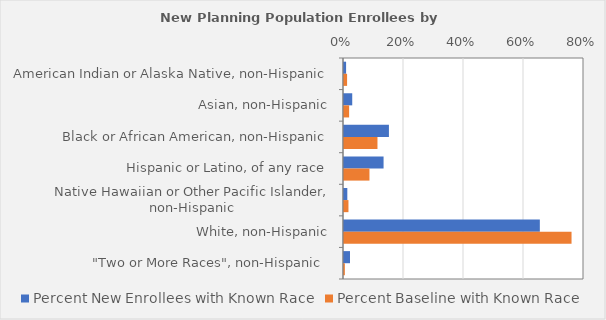
| Category | Percent New Enrollees with Known Race | Percent Baseline with Known Race |
|---|---|---|
| American Indian or Alaska Native, non-Hispanic | 0.007 | 0.01 |
| Asian, non-Hispanic | 0.027 | 0.017 |
| Black or African American, non-Hispanic | 0.15 | 0.112 |
| Hispanic or Latino, of any race | 0.132 | 0.085 |
| Native Hawaiian or Other Pacific Islander, non-Hispanic | 0.011 | 0.015 |
| White, non-Hispanic | 0.653 | 0.758 |
| "Two or More Races", non-Hispanic  | 0.02 | 0.003 |